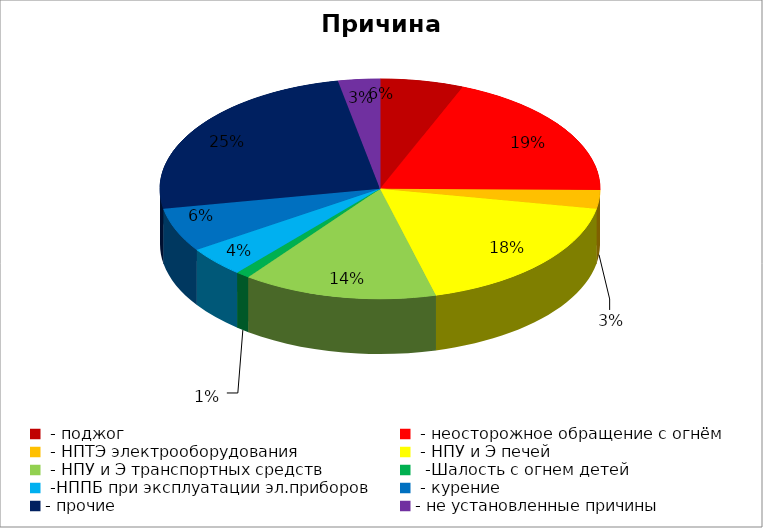
| Category | Причина пожара |
|---|---|
|  - поджог | 18 |
|  - неосторожное обращение с огнём | 56 |
|  - НПТЭ электрооборудования | 8 |
|  - НПУ и Э печей | 53 |
|  - НПУ и Э транспортных средств | 42 |
|   -Шалость с огнем детей | 3 |
|  -НППБ при эксплуатации эл.приборов | 13 |
|  - курение | 19 |
| - прочие | 73 |
| - не установленные причины | 9 |